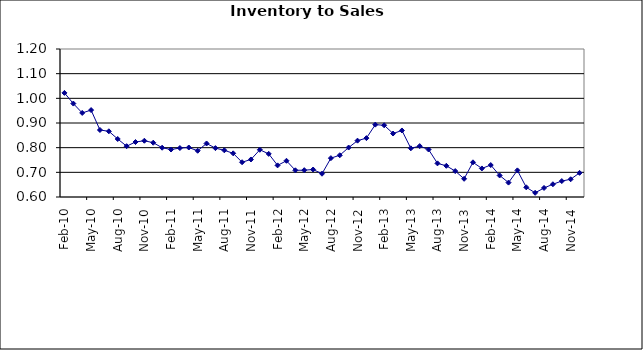
| Category | Series 0 |
|---|---|
| 2006-02-01 | 1.022 |
| 2006-03-01 | 0.979 |
| 2006-04-01 | 0.941 |
| 2006-05-01 | 0.952 |
| 2006-06-01 | 0.872 |
| 2006-07-01 | 0.866 |
| 2006-08-01 | 0.835 |
| 2006-09-01 | 0.806 |
| 2006-10-01 | 0.823 |
| 2006-11-01 | 0.828 |
| 2006-12-01 | 0.82 |
| 2007-01-01 | 0.8 |
| 2007-02-01 | 0.792 |
| 2007-03-01 | 0.798 |
| 2007-04-01 | 0.801 |
| 2007-05-01 | 0.787 |
| 2007-06-01 | 0.817 |
| 2007-07-01 | 0.798 |
| 2007-08-01 | 0.789 |
| 2007-09-01 | 0.777 |
| 2007-10-01 | 0.741 |
| 2007-11-01 | 0.752 |
| 2007-12-01 | 0.791 |
| 2008-01-01 | 0.775 |
| 2008-02-01 | 0.728 |
| 2008-03-01 | 0.747 |
| 2008-04-01 | 0.708 |
| 2008-05-01 | 0.709 |
| 2008-06-01 | 0.711 |
| 2008-07-01 | 0.694 |
| 2008-08-01 | 0.758 |
| 2008-09-01 | 0.769 |
| 2008-10-01 | 0.8 |
| 2008-11-01 | 0.828 |
| 2008-12-01 | 0.839 |
| 2009-01-01 | 0.893 |
| 2009-02-01 | 0.891 |
| 2009-03-01 | 0.857 |
| 2009-04-01 | 0.87 |
| 2009-05-01 | 0.797 |
| 2009-06-01 | 0.806 |
| 2009-07-01 | 0.793 |
| 2009-08-01 | 0.736 |
| 2009-09-01 | 0.726 |
| 2009-10-01 | 0.705 |
| 2009-11-01 | 0.674 |
| 2009-12-01 | 0.741 |
| 2010-01-01 | 0.716 |
| 2010-02-01 | 0.73 |
| 2010-03-01 | 0.687 |
| 2010-04-01 | 0.658 |
| 2010-05-01 | 0.708 |
| 2010-06-01 | 0.639 |
| 2010-07-01 | 0.617 |
| 2010-08-01 | 0.637 |
| 2010-09-01 | 0.652 |
| 2010-10-01 | 0.665 |
| 2010-11-01 | 0.672 |
| 2010-12-01 | 0.698 |